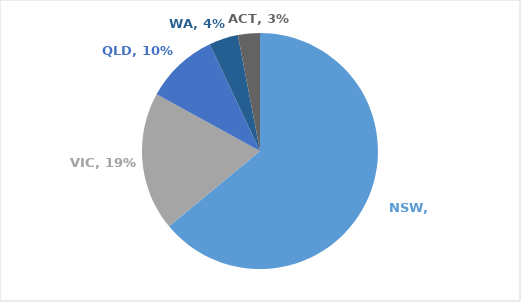
| Category | Series 0 |
|---|---|
| NSW | 0.64 |
| VIC | 0.19 |
| QLD | 0.1 |
| WA | 0.04 |
| ACT | 0.03 |